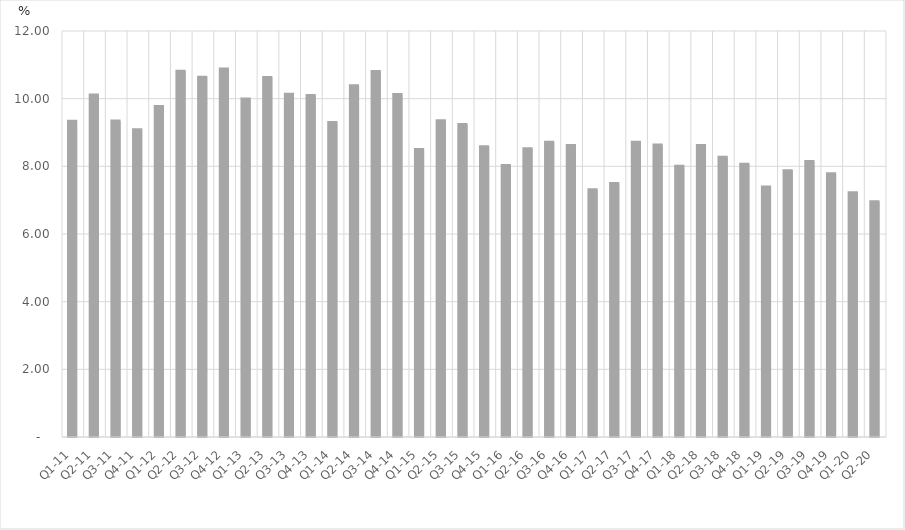
| Category | Percent of Total GDP |
|---|---|
| Q1-11 | 9.33 |
| Q2-11 | 10.111 |
| Q3-11 | 9.338 |
| Q4-11 | 9.081 |
| Q1-12 | 9.769 |
| Q2-12 | 10.813 |
| Q3-12 | 10.635 |
| Q4-12 | 10.877 |
| Q1-13 | 9.99 |
| Q2-13 | 10.622 |
| Q3-13 | 10.133 |
| Q4-13 | 10.095 |
| Q1-14 | 9.298 |
| Q2-14 | 10.378 |
| Q3-14 | 10.803 |
| Q4-14 | 10.123 |
| Q1-15 | 8.498 |
| Q2-15 | 9.348 |
| Q3-15 | 9.236 |
| Q4-15 | 8.58 |
| Q1-16 | 8.023 |
| Q2-16 | 8.521 |
| Q3-16 | 8.711 |
| Q4-16 | 8.614 |
| Q1-17 | 7.308 |
| Q2-17 | 7.491 |
| Q3-17 | 8.71 |
| Q4-17 | 8.632 |
| Q1-18 | 8.005 |
| Q2-18 | 8.616 |
| Q3-18 | 8.272 |
| Q4-18 | 8.061 |
| Q1-19 | 7.388 |
| Q2-19 | 7.872 |
| Q3-19 | 8.143 |
| Q4-19 | 7.779 |
| Q1-20 | 7.222 |
| Q2-20 | 6.954 |